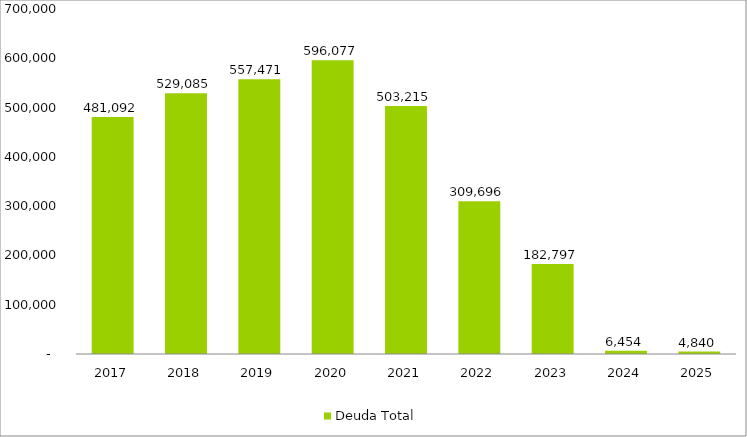
| Category | Deuda Total |
|---|---|
| 2017 | 481091.515 |
| 2018 | 529085.152 |
| 2019 | 557470.878 |
| 2020 | 596077.186 |
| 2021 | 503215.326 |
| 2022 | 309696.232 |
| 2023 | 182796.693 |
| 2024 | 6453.836 |
| 2025 | 4840.377 |